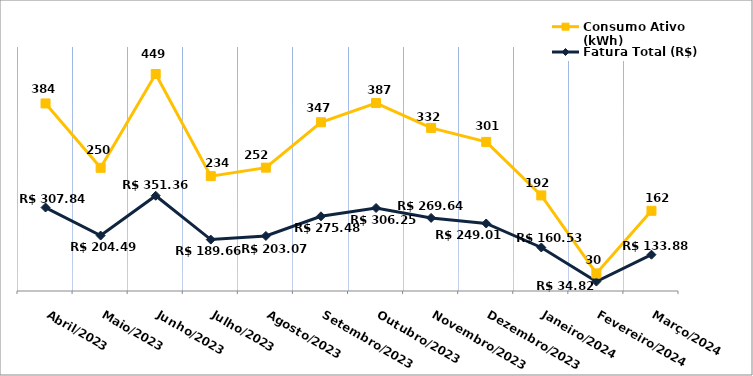
| Category | Fatura Total (R$) | Consumo Ativo (kWh) |
|---|---|---|
| Abril/2023 | 307.84 | 384 |
| Maio/2023 | 204.49 | 250 |
| Junho/2023 | 351.36 | 449 |
| Julho/2023 | 189.66 | 234 |
| Agosto/2023 | 203.07 | 252 |
| Setembro/2023 | 275.48 | 347 |
| Outubro/2023 | 306.25 | 387 |
| Novembro/2023 | 269.64 | 332 |
| Dezembro/2023 | 249.01 | 301 |
| Janeiro/2024 | 160.53 | 192 |
| Fevereiro/2024 | 34.82 | 30 |
| Março/2024 | 133.88 | 162 |